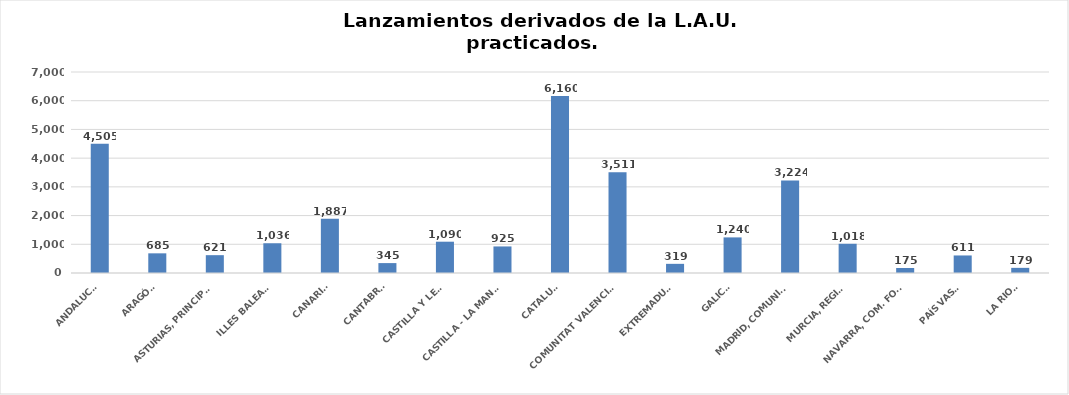
| Category | Series 0 |
|---|---|
| ANDALUCÍA | 4505 |
| ARAGÓN | 685 |
| ASTURIAS, PRINCIPADO | 621 |
| ILLES BALEARS | 1036 |
| CANARIAS | 1887 |
| CANTABRIA | 345 |
| CASTILLA Y LEÓN | 1090 |
| CASTILLA - LA MANCHA | 925 |
| CATALUÑA | 6160 |
| COMUNITAT VALENCIANA | 3511 |
| EXTREMADURA | 319 |
| GALICIA | 1240 |
| MADRID, COMUNIDAD | 3224 |
| MURCIA, REGIÓN | 1018 |
| NAVARRA, COM. FORAL | 175 |
| PAÍS VASCO | 611 |
| LA RIOJA | 179 |